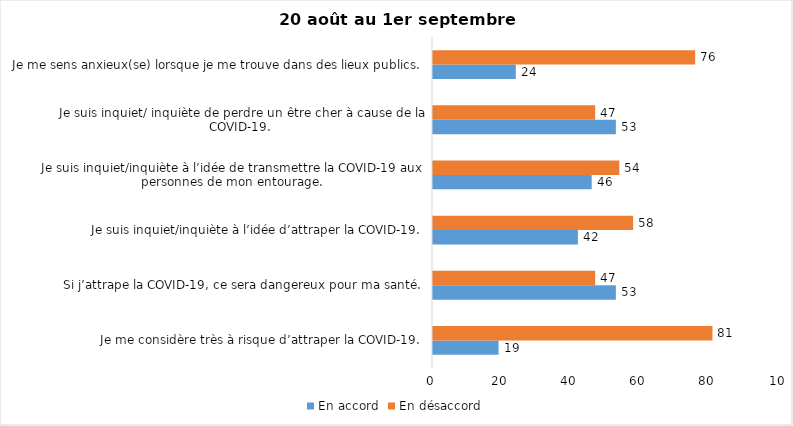
| Category | En accord | En désaccord |
|---|---|---|
| Je me considère très à risque d’attraper la COVID-19. | 19 | 81 |
| Si j’attrape la COVID-19, ce sera dangereux pour ma santé. | 53 | 47 |
| Je suis inquiet/inquiète à l’idée d’attraper la COVID-19. | 42 | 58 |
| Je suis inquiet/inquiète à l’idée de transmettre la COVID-19 aux personnes de mon entourage. | 46 | 54 |
| Je suis inquiet/ inquiète de perdre un être cher à cause de la COVID-19. | 53 | 47 |
| Je me sens anxieux(se) lorsque je me trouve dans des lieux publics. | 24 | 76 |